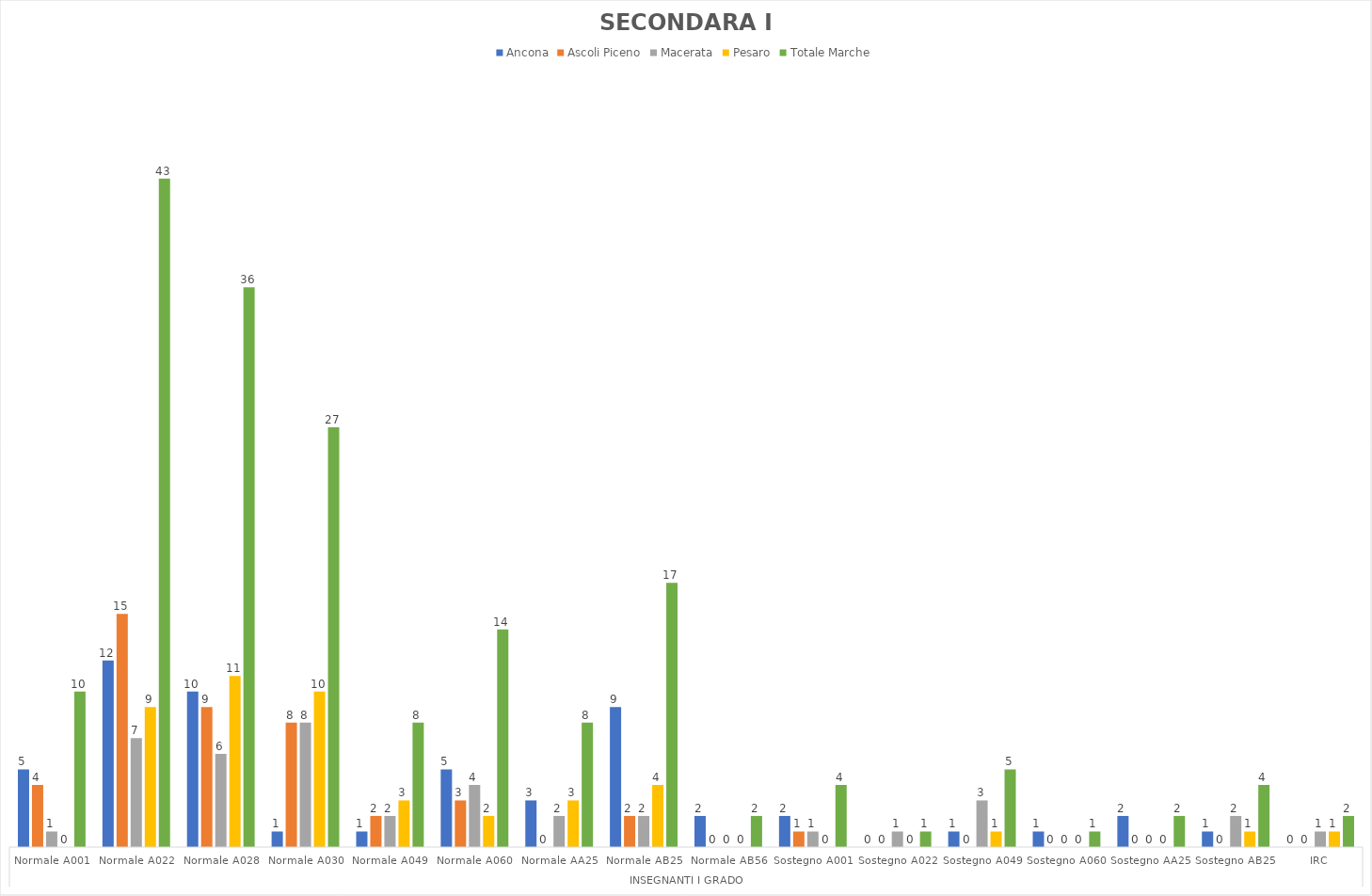
| Category | Ancona | Ascoli Piceno | Macerata | Pesaro | Totale Marche |
|---|---|---|---|---|---|
| 0 | 5 | 4 | 1 | 0 | 10 |
| 1 | 12 | 15 | 7 | 9 | 43 |
| 2 | 10 | 9 | 6 | 11 | 36 |
| 3 | 1 | 8 | 8 | 10 | 27 |
| 4 | 1 | 2 | 2 | 3 | 8 |
| 5 | 5 | 3 | 4 | 2 | 14 |
| 6 | 3 | 0 | 2 | 3 | 8 |
| 7 | 9 | 2 | 2 | 4 | 17 |
| 8 | 2 | 0 | 0 | 0 | 2 |
| 9 | 2 | 1 | 1 | 0 | 4 |
| 10 | 0 | 0 | 1 | 0 | 1 |
| 11 | 1 | 0 | 3 | 1 | 5 |
| 12 | 1 | 0 | 0 | 0 | 1 |
| 13 | 2 | 0 | 0 | 0 | 2 |
| 14 | 1 | 0 | 2 | 1 | 4 |
| 15 | 0 | 0 | 1 | 1 | 2 |